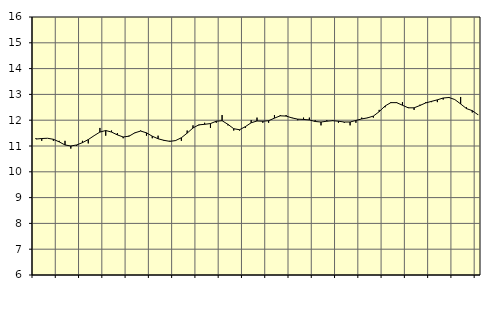
| Category | Piggar | Handel, SNI 45-47 |
|---|---|---|
| nan | 11.3 | 11.27 |
| 1.0 | 11.2 | 11.29 |
| 1.0 | 11.3 | 11.3 |
| 1.0 | 11.2 | 11.26 |
| nan | 11.2 | 11.16 |
| 2.0 | 11.2 | 11.04 |
| 2.0 | 10.9 | 11 |
| 2.0 | 11 | 11.04 |
| nan | 11.2 | 11.13 |
| 3.0 | 11.1 | 11.25 |
| 3.0 | 11.4 | 11.4 |
| 3.0 | 11.7 | 11.54 |
| nan | 11.4 | 11.6 |
| 4.0 | 11.6 | 11.54 |
| 4.0 | 11.5 | 11.43 |
| 4.0 | 11.3 | 11.35 |
| nan | 11.4 | 11.38 |
| 5.0 | 11.5 | 11.51 |
| 5.0 | 11.6 | 11.58 |
| 5.0 | 11.4 | 11.51 |
| nan | 11.3 | 11.38 |
| 6.0 | 11.4 | 11.28 |
| 6.0 | 11.2 | 11.22 |
| 6.0 | 11.2 | 11.18 |
| nan | 11.2 | 11.21 |
| 7.0 | 11.2 | 11.32 |
| 7.0 | 11.6 | 11.5 |
| 7.0 | 11.8 | 11.7 |
| nan | 11.8 | 11.82 |
| 8.0 | 11.9 | 11.84 |
| 8.0 | 11.7 | 11.87 |
| 8.0 | 11.9 | 11.96 |
| nan | 12.2 | 11.98 |
| 9.0 | 11.8 | 11.84 |
| 9.0 | 11.6 | 11.67 |
| 9.0 | 11.6 | 11.63 |
| nan | 11.7 | 11.75 |
| 10.0 | 12 | 11.9 |
| 10.0 | 12.1 | 11.97 |
| 10.0 | 11.9 | 11.96 |
| nan | 11.9 | 11.98 |
| 11.0 | 12.2 | 12.08 |
| 11.0 | 12.2 | 12.17 |
| 11.0 | 12.2 | 12.16 |
| nan | 12.1 | 12.09 |
| 12.0 | 12 | 12.04 |
| 12.0 | 12.1 | 12.03 |
| 12.0 | 12.1 | 12.01 |
| nan | 12 | 11.95 |
| 13.0 | 11.8 | 11.93 |
| 13.0 | 12 | 11.96 |
| 13.0 | 12 | 11.98 |
| nan | 11.9 | 11.96 |
| 14.0 | 11.9 | 11.93 |
| 14.0 | 11.8 | 11.93 |
| 14.0 | 11.9 | 11.99 |
| nan | 12.1 | 12.05 |
| 15.0 | 12.1 | 12.09 |
| 15.0 | 12.1 | 12.16 |
| 15.0 | 12.4 | 12.33 |
| nan | 12.5 | 12.55 |
| 16.0 | 12.7 | 12.68 |
| 16.0 | 12.7 | 12.68 |
| 16.0 | 12.7 | 12.58 |
| nan | 12.5 | 12.48 |
| 17.0 | 12.4 | 12.48 |
| 17.0 | 12.6 | 12.57 |
| 17.0 | 12.7 | 12.67 |
| nan | 12.7 | 12.73 |
| 18.0 | 12.7 | 12.79 |
| 18.0 | 12.8 | 12.86 |
| 18.0 | 12.9 | 12.88 |
| nan | 12.8 | 12.8 |
| 19.0 | 12.9 | 12.63 |
| 19.0 | 12.5 | 12.45 |
| 19.0 | 12.3 | 12.37 |
| nan | 12.2 | 12.21 |